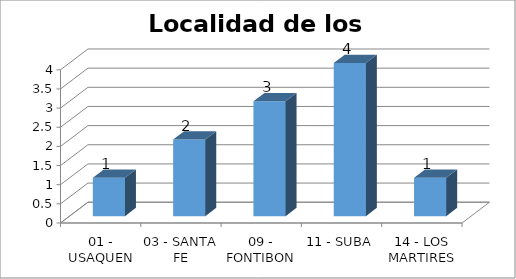
| Category | Total |
|---|---|
| 01 - USAQUEN | 1 |
| 03 - SANTA FE | 2 |
| 09 - FONTIBON | 3 |
| 11 - SUBA | 4 |
| 14 - LOS MARTIRES | 1 |